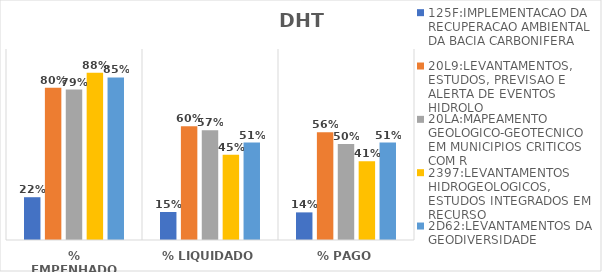
| Category | 125F:IMPLEMENTACAO DA RECUPERACAO AMBIENTAL DA BACIA CARBONIFERA | 20L9:LEVANTAMENTOS, ESTUDOS, PREVISAO E ALERTA DE EVENTOS HIDROLO | 20LA:MAPEAMENTO GEOLOGICO-GEOTECNICO EM MUNICIPIOS CRITICOS COM R | 2397:LEVANTAMENTOS HIDROGEOLOGICOS, ESTUDOS INTEGRADOS EM RECURSO | 2D62:LEVANTAMENTOS DA GEODIVERSIDADE |
|---|---|---|---|---|---|
| % EMPENHADO | 0.224 | 0.797 | 0.788 | 0.876 | 0.851 |
| % LIQUIDADO | 0.147 | 0.596 | 0.574 | 0.446 | 0.51 |
| % PAGO | 0.145 | 0.565 | 0.503 | 0.412 | 0.51 |